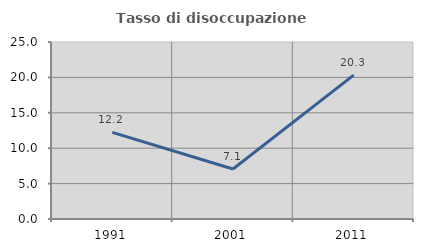
| Category | Tasso di disoccupazione giovanile  |
|---|---|
| 1991.0 | 12.234 |
| 2001.0 | 7.059 |
| 2011.0 | 20.312 |